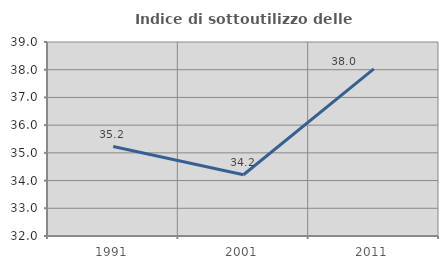
| Category | Indice di sottoutilizzo delle abitazioni  |
|---|---|
| 1991.0 | 35.227 |
| 2001.0 | 34.211 |
| 2011.0 | 38.028 |